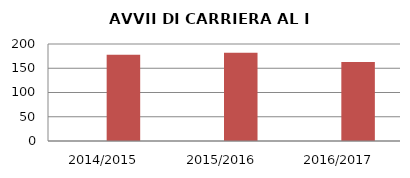
| Category | ANNO | NUMERO |
|---|---|---|
| 2014/2015 | 0 | 178 |
| 2015/2016 | 0 | 182 |
| 2016/2017 | 0 | 163 |